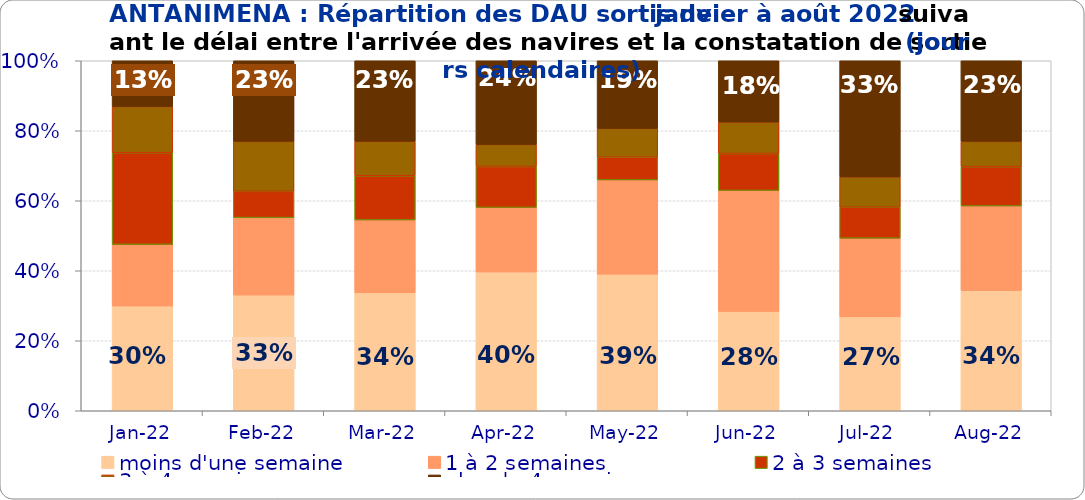
| Category | moins d'une semaine | 1 à 2 semaines | 2 à 3 semaines | 3 à 4 semaines | plus de 4 semaines |
|---|---|---|---|---|---|
| 2022-01-01 | 0.299 | 0.176 | 0.262 | 0.132 | 0.131 |
| 2022-02-01 | 0.331 | 0.221 | 0.075 | 0.143 | 0.23 |
| 2022-03-01 | 0.337 | 0.208 | 0.126 | 0.099 | 0.23 |
| 2022-04-01 | 0.396 | 0.185 | 0.117 | 0.063 | 0.239 |
| 2022-05-01 | 0.39 | 0.269 | 0.065 | 0.082 | 0.193 |
| 2022-06-01 | 0.284 | 0.346 | 0.106 | 0.09 | 0.175 |
| 2022-07-01 | 0.268 | 0.225 | 0.088 | 0.087 | 0.332 |
| 2022-08-01 | 0.343 | 0.242 | 0.112 | 0.072 | 0.23 |